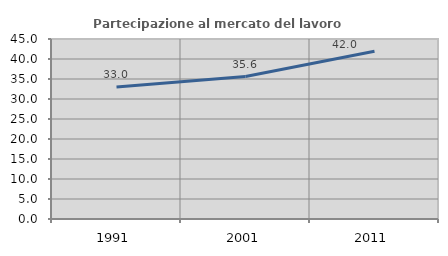
| Category | Partecipazione al mercato del lavoro  femminile |
|---|---|
| 1991.0 | 32.984 |
| 2001.0 | 35.615 |
| 2011.0 | 41.95 |